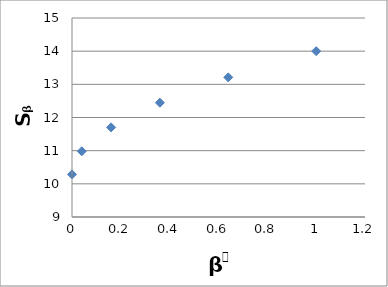
| Category | Series 0 |
|---|---|
| 1.0 | 14 |
| 0.6400000000000001 | 13.211 |
| 0.36 | 12.446 |
| 0.16000000000000003 | 11.703 |
| 0.04000000000000001 | 10.983 |
| 0.0 | 10.286 |